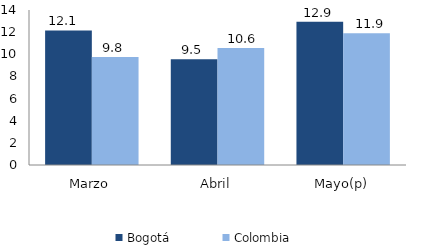
| Category | Bogotá | Colombia |
|---|---|---|
| Marzo | 12.149 | 9.765 |
| Abril | 9.546 | 10.579 |
| Mayo(p) | 12.933 | 11.905 |